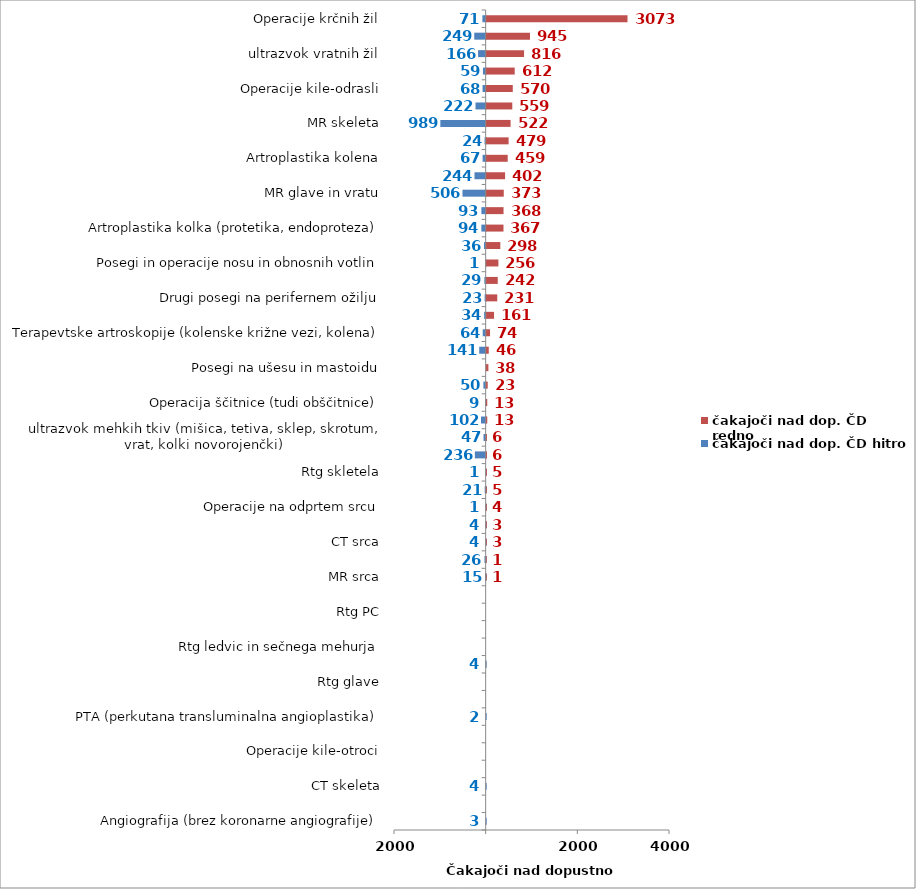
| Category | čakajoči nad dop. ČD hitro | čakajoči nad dop. ČD redno |
|---|---|---|
| Angiografija (brez koronarne angiografije) | -3 | 0 |
| Artroplastika gležnja | 0 | 0 |
| CT skeleta | -4 | 0 |
| Elektroencefalografija (EEG) | 0 | 0 |
| Operacije kile-otroci | 0 | 0 |
| Posegi na arterijah (brez PTA) | 0 | 0 |
| PTA (perkutana transluminalna angioplastika) | -2 | 0 |
| Rtg abdomna | 0 | 0 |
| Rtg glave | 0 | 0 |
| Rtg hrbtenice | -4 | 0 |
| Rtg ledvic in sečnega mehurja | 0 | 0 |
| Rtg mamografija | 0 | 0 |
| Rtg PC | 0 | 0 |
| Sklerozacija krčnih žil | 0 | 0 |
| MR srca | -15 | 1 |
| ultrazvok rame | -26 | 1 |
| CT srca | -4 | 3 |
| MR angiografije | -4 | 3 |
| Operacije na odprtem srcu | -1 | 4 |
| CT glave in vratu | -21 | 5 |
| Rtg skletela | -1 | 5 |
| Operacija karpalnega kanala | -236 | 6 |
| ultrazvok mehkih tkiv (mišica, tetiva, sklep, skrotum, vrat, kolki novorojenčki) | -47 | 6 |
| CT toraks in abdomen | -102 | 13 |
| Operacija ščitnice (tudi obščitnice) | -9 | 13 |
| MR toraks in abdomen | -50 | 23 |
| Posegi na ušesu in mastoidu | 0 | 38 |
| CT angiografije | -141 | 46 |
| Terapevtske artroskopije (kolenske križne vezi, kolena) | -64 | 74 |
| Ortopedska operacija rame (samo terapevstki posegi na rami) | -34 | 161 |
| Drugi posegi na perifernem ožilju | -23 | 231 |
| Operacija sive mrene (katarakta) | -29 | 242 |
| Posegi in operacije nosu in obnosnih votlin | -1 | 256 |
| Operacije žolčnih kamnov | -36 | 298 |
| Artroplastika kolka (protetika, endoproteza) | -94 | 367 |
| Posegi in operacije hrbtenice | -93 | 368 |
| MR glave in vratu | -506 | 373 |
| Elektromiografija (EMG) | -244 | 402 |
| Artroplastika kolena | -67 | 459 |
| ultrazvok dojke | -24 | 479 |
| MR skeleta | -989 | 522 |
| Koronarna angiografija in PTCA | -222 | 559 |
| Operacije kile-odrasli | -68 | 570 |
| Posegi in operacije v ustih, grlu in žrelu | -59 | 612 |
| ultrazvok vratnih žil | -166 | 816 |
| ultrazvok srca | -249 | 945 |
| Operacije krčnih žil | -71 | 3073 |